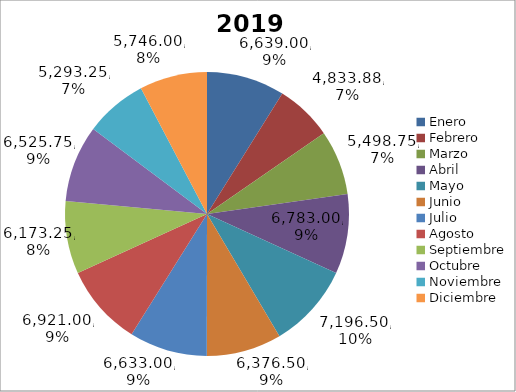
| Category | Año 2019  Valor $ | Año 2019  Toneladas |
|---|---|---|
| Enero | 6639 | 265.56 |
| Febrero | 4833.88 | 193.36 |
| Marzo | 5498.75 | 219.95 |
| Abril | 6783 | 271.32 |
| Mayo | 7196.5 | 287.86 |
| Junio | 6376.5 | 255.06 |
| Julio | 6633 | 265.32 |
| Agosto | 6921 | 276.84 |
| Septiembre | 6173.25 | 246.93 |
| Octubre | 6525.75 | 261.03 |
| Noviembre | 5293.25 | 211.73 |
| Diciembre | 5746 | 229.84 |